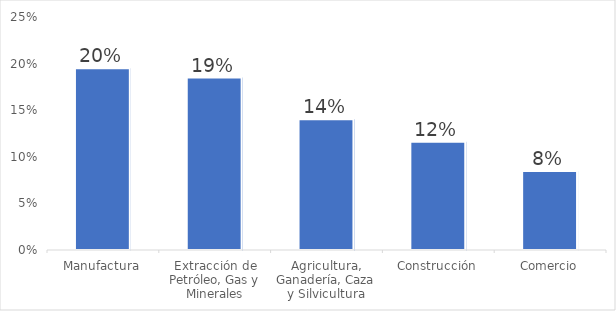
| Category | Series 0 |
|---|---|
| Manufactura | 0.195 |
| Extracción de Petróleo, Gas y Minerales | 0.185 |
| Agricultura, Ganadería, Caza y Silvicultura | 0.14 |
| Construcción | 0.116 |
| Comercio | 0.085 |